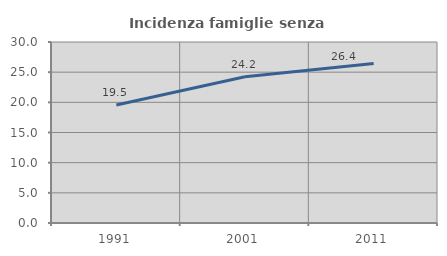
| Category | Incidenza famiglie senza nuclei |
|---|---|
| 1991.0 | 19.548 |
| 2001.0 | 24.23 |
| 2011.0 | 26.43 |